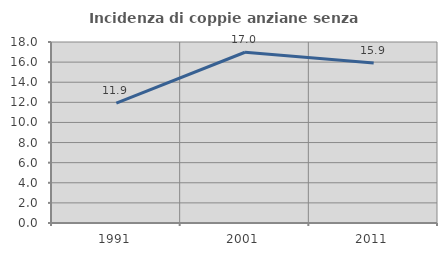
| Category | Incidenza di coppie anziane senza figli  |
|---|---|
| 1991.0 | 11.921 |
| 2001.0 | 16.981 |
| 2011.0 | 15.909 |